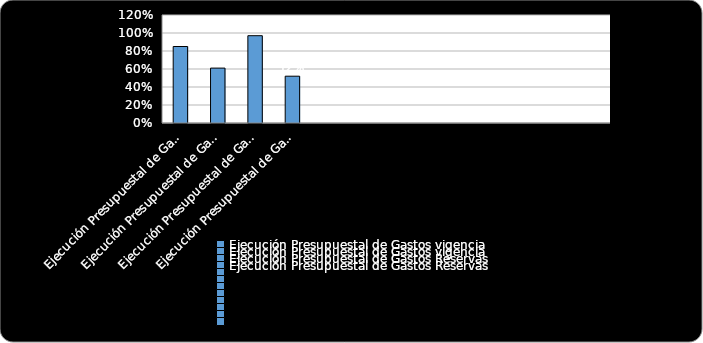
| Category | % Cumplimiento  |
|---|---|
| Ejecución Presupuestal de Gastos vigencia | 0.85 |
| Ejecución Presupuestal de Gastos vigencia | 0.61 |
| Ejecución Presupuestal de Gastos Reservas | 0.97 |
| Ejecución Presupuestal de Gastos Reservas | 0.52 |